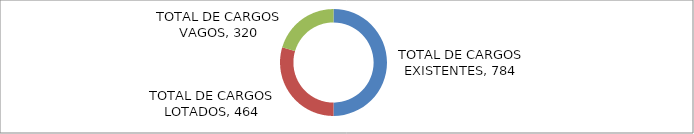
| Category | Series 0 | Series 1 |
|---|---|---|
| TOTAL DE CARGOS EXISTENTES |  | 784 |
| TOTAL DE CARGOS LOTADOS |  | 464 |
| TOTAL DE CARGOS VAGOS |  | 320 |